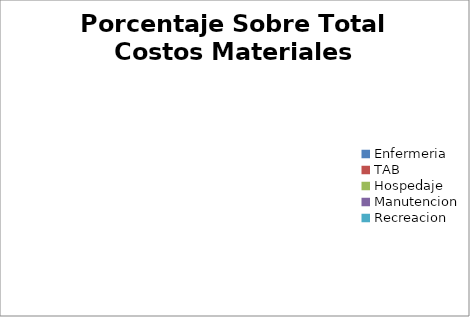
| Category | Porcentaje Sobre Total Costos Indirectos |
|---|---|
| Enfermeria | 0 |
| TAB | 0 |
| Hospedaje | 0 |
| Manutencion | 0 |
| Recreacion | 0 |